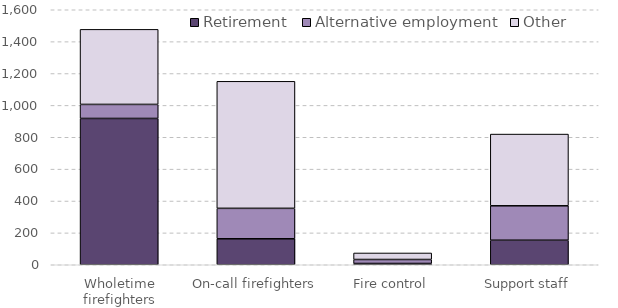
| Category | Retirement | Alternative employment | Other |
|---|---|---|---|
| Wholetime firefighters | 918 | 88 | 471 |
| On-call firefighters | 163 | 191 | 797 |
| Fire control | 8 | 25 | 41 |
| Support staff | 154 | 216 | 450 |